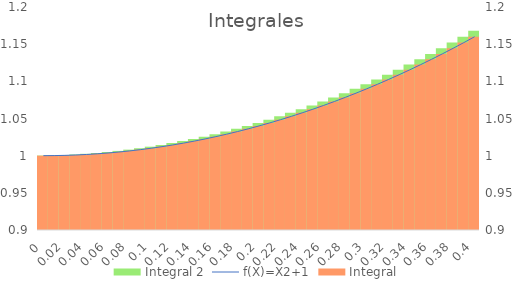
| Category | Integral 2 |
|---|---|
| 0.0 | 1 |
| 0.01 | 1 |
| 0.02 | 1.001 |
| 0.03 | 1.002 |
| 0.04 | 1.002 |
| 0.05 | 1.004 |
| 0.06 | 1.005 |
| 0.07 | 1.006 |
| 0.08 | 1.008 |
| 0.09 | 1.01 |
| 0.1 | 1.012 |
| 0.11 | 1.014 |
| 0.12 | 1.017 |
| 0.13 | 1.02 |
| 0.14 | 1.022 |
| 0.15 | 1.026 |
| 0.16 | 1.029 |
| 0.17 | 1.032 |
| 0.18 | 1.036 |
| 0.19 | 1.04 |
| 0.2 | 1.044 |
| 0.21 | 1.048 |
| 0.22 | 1.053 |
| 0.23 | 1.058 |
| 0.24 | 1.062 |
| 0.25 | 1.068 |
| 0.26 | 1.073 |
| 0.27 | 1.078 |
| 0.28 | 1.084 |
| 0.29 | 1.09 |
| 0.3 | 1.096 |
| 0.31 | 1.102 |
| 0.32 | 1.109 |
| 0.33 | 1.116 |
| 0.34 | 1.122 |
| 0.35 | 1.13 |
| 0.36 | 1.137 |
| 0.37 | 1.144 |
| 0.38 | 1.152 |
| 0.39 | 1.16 |
| 0.4 | 1.168 |